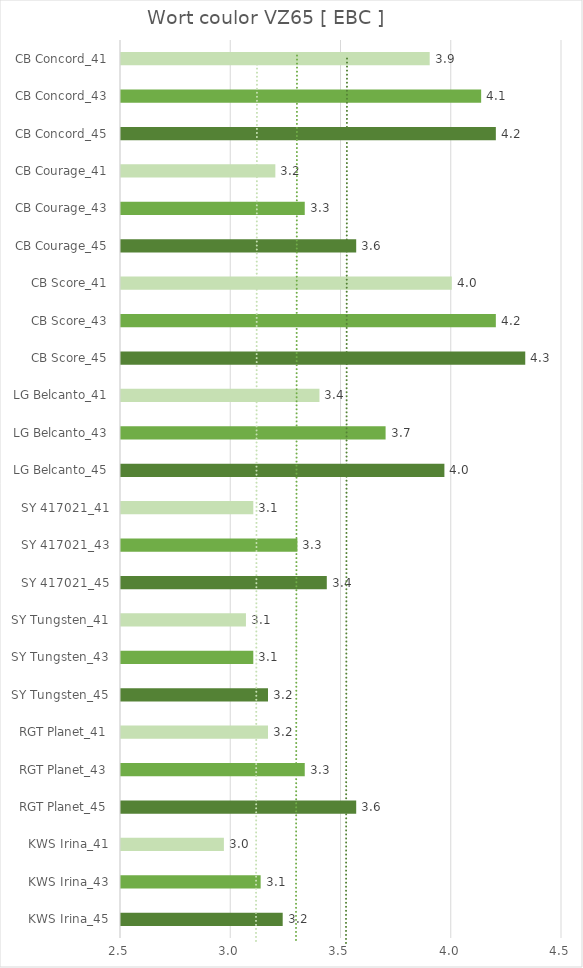
| Category |   Wort coulor VZ65 [ EBC ] |
|---|---|
| KWS Irina_45 | 3.233 |
| KWS Irina_43 | 3.133 |
| KWS Irina_41 | 2.967 |
| RGT Planet_45 | 3.567 |
| RGT Planet_43 | 3.333 |
| RGT Planet_41 | 3.167 |
| SY Tungsten_45 | 3.167 |
| SY Tungsten_43 | 3.1 |
| SY Tungsten_41 | 3.067 |
| SY 417021_45 | 3.433 |
| SY 417021_43 | 3.3 |
| SY 417021_41 | 3.1 |
| LG Belcanto_45 | 3.967 |
| LG Belcanto_43 | 3.7 |
| LG Belcanto_41 | 3.4 |
| CB Score_45 | 4.333 |
| CB Score_43 | 4.2 |
| CB Score_41 | 4 |
| CB Courage_45 | 3.567 |
| CB Courage_43 | 3.333 |
| CB Courage_41 | 3.2 |
| CB Concord_45 | 4.2 |
| CB Concord_43 | 4.133 |
| CB Concord_41 | 3.9 |